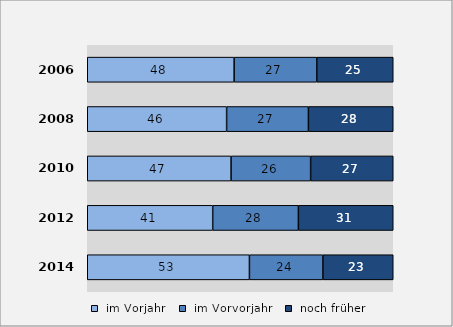
| Category |  im Vorjahr |  im Vorvorjahr |  noch früher |
|---|---|---|---|
| 2014.0 | 53 | 24 | 23 |
| 2012.0 | 41 | 28 | 31 |
| 2010.0 | 47 | 26 | 27 |
| 2008.0 | 46 | 27 | 28 |
| 2006.0 | 48 | 27 | 25 |